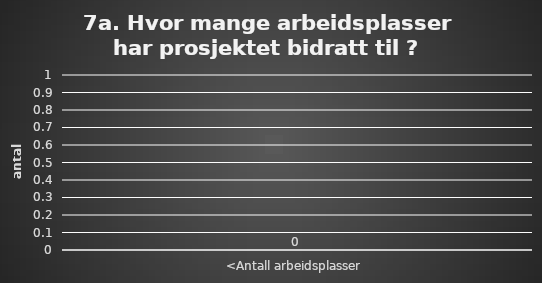
| Category | Series 0 |
|---|---|
| <Antall arbeidsplasser | 0 |